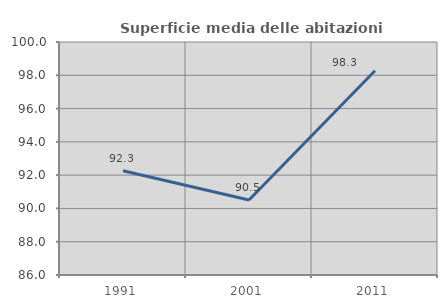
| Category | Superficie media delle abitazioni occupate |
|---|---|
| 1991.0 | 92.267 |
| 2001.0 | 90.51 |
| 2011.0 | 98.273 |